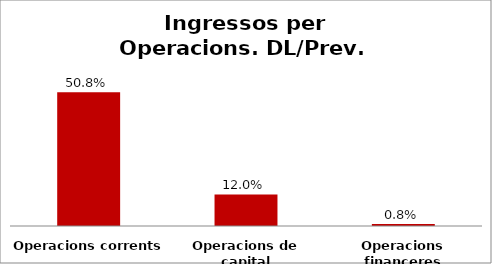
| Category | Series 0 |
|---|---|
| Operacions corrents | 0.508 |
| Operacions de capital | 0.12 |
| Operacions financeres | 0.008 |